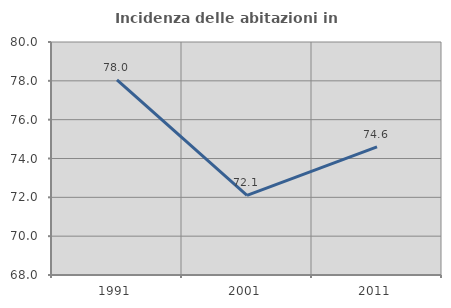
| Category | Incidenza delle abitazioni in proprietà  |
|---|---|
| 1991.0 | 78.049 |
| 2001.0 | 72.101 |
| 2011.0 | 74.603 |